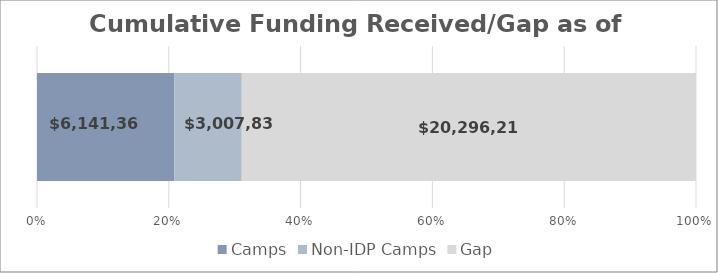
| Category | Camps | Non-IDP Camps | Gap |
|---|---|---|---|
| 0 | 6141359.657 | 3007836.631 | 20296214.265 |